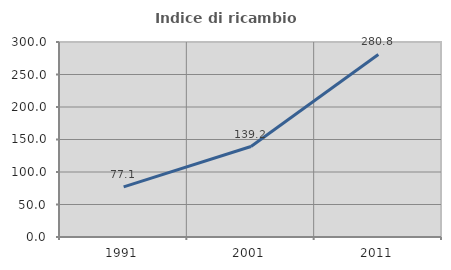
| Category | Indice di ricambio occupazionale  |
|---|---|
| 1991.0 | 77.119 |
| 2001.0 | 139.157 |
| 2011.0 | 280.833 |